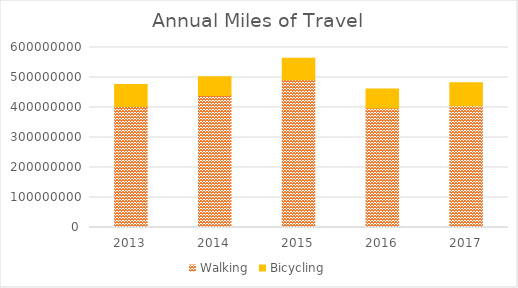
| Category | Walking | Bicycling |
|---|---|---|
| 2013 | 403152026.79 | 73856012.063 |
| 2014 | 439627849.245 | 62540553.775 |
| 2015 | 492298356.358 | 71455084.923 |
| 2016 | 398216768.366 | 63866277.932 |
| 2017 | 405507413.905 | 77200137.75 |